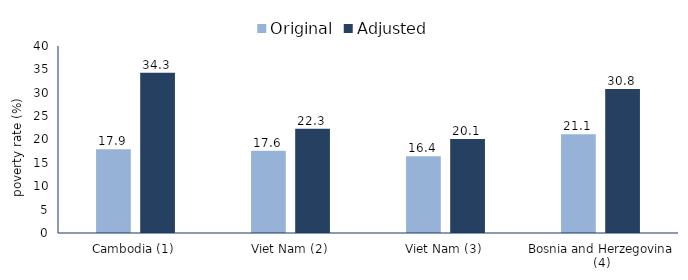
| Category | Original | Adjusted |
|---|---|---|
| Cambodia (1) | 17.9 | 34.3 |
| Viet Nam (2) | 17.6 | 22.3 |
| Viet Nam (3) | 16.4 | 20.1 |
| Bosnia and Herzegovina (4) | 21.1 | 30.8 |